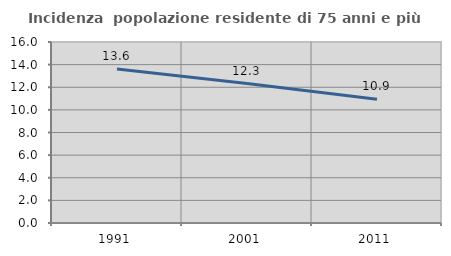
| Category | Incidenza  popolazione residente di 75 anni e più |
|---|---|
| 1991.0 | 13.618 |
| 2001.0 | 12.33 |
| 2011.0 | 10.934 |